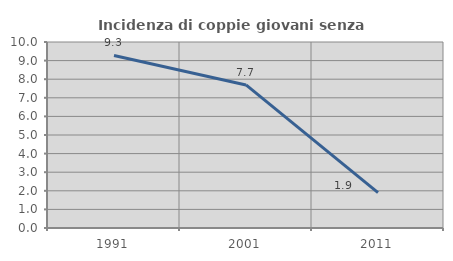
| Category | Incidenza di coppie giovani senza figli |
|---|---|
| 1991.0 | 9.278 |
| 2001.0 | 7.692 |
| 2011.0 | 1.905 |